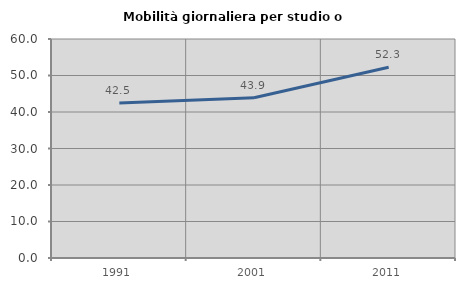
| Category | Mobilità giornaliera per studio o lavoro |
|---|---|
| 1991.0 | 42.454 |
| 2001.0 | 43.882 |
| 2011.0 | 52.25 |